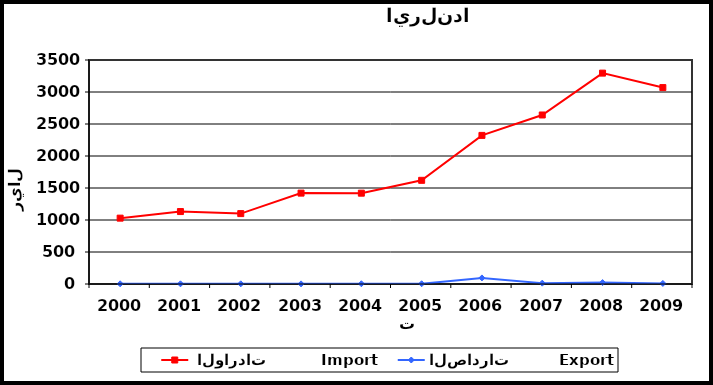
| Category |  الواردات           Import | الصادرات          Export |
|---|---|---|
| 2000.0 | 1029 | 3 |
| 2001.0 | 1132 | 3 |
| 2002.0 | 1100 | 3 |
| 2003.0 | 1420 | 2 |
| 2004.0 | 1419 | 4 |
| 2005.0 | 1620 | 4 |
| 2006.0 | 2322 | 95 |
| 2007.0 | 2641 | 13 |
| 2008.0 | 3295 | 22 |
| 2009.0 | 3069 | 9 |